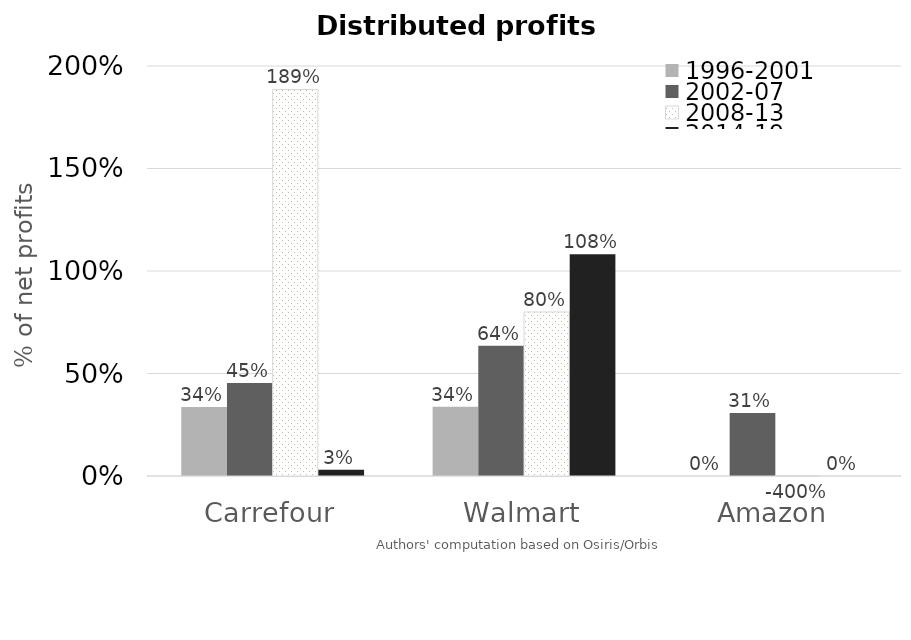
| Category | 1996-2001 | 2002-07 | 2008-13 | 2014-19 |
|---|---|---|---|---|
| Carrefour | 0.337 | 0.454 | 1.886 | 0.03 |
| Walmart | 0.338 | 0.635 | 0.8 | 1.082 |
| Amazon | 0 | 0.308 | -4.004 | 0 |